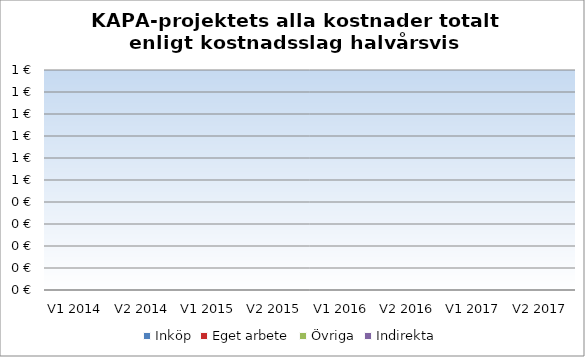
| Category | Inköp | Eget arbete | Övriga | Indirekta |
|---|---|---|---|---|
| V1 2014 | 0 | 0 | 0 | 0 |
| V2 2014 | 0 | 0 | 0 | 0 |
| V1 2015 | 0 | 0 | 0 | 0 |
| V2 2015 | 0 | 0 | 0 | 0 |
| V1 2016 | 0 | 0 | 0 | 0 |
| V2 2016 | 0 | 0 | 0 | 0 |
| V1 2017 | 0 | 0 | 0 | 0 |
| V2 2017 | 0 | 0 | 0 | 0 |